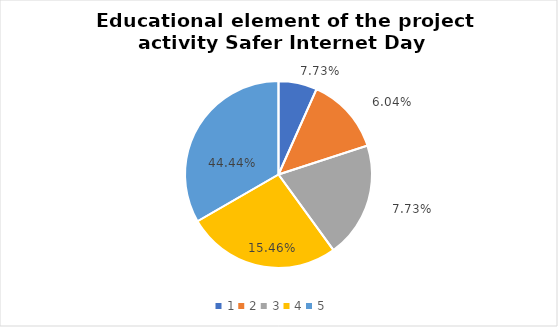
| Category | Series 0 | Series 1 |
|---|---|---|
| 0 | 1 | 0.077 |
| 1 | 2 | 0.06 |
| 2 | 3 | 0.077 |
| 3 | 4 | 0.155 |
| 4 | 5 | 0.444 |